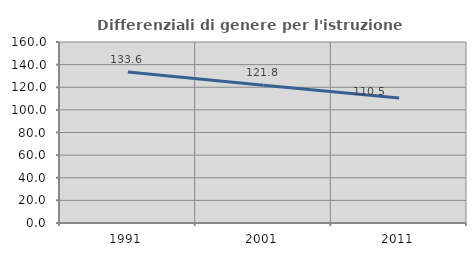
| Category | Differenziali di genere per l'istruzione superiore |
|---|---|
| 1991.0 | 133.576 |
| 2001.0 | 121.79 |
| 2011.0 | 110.453 |